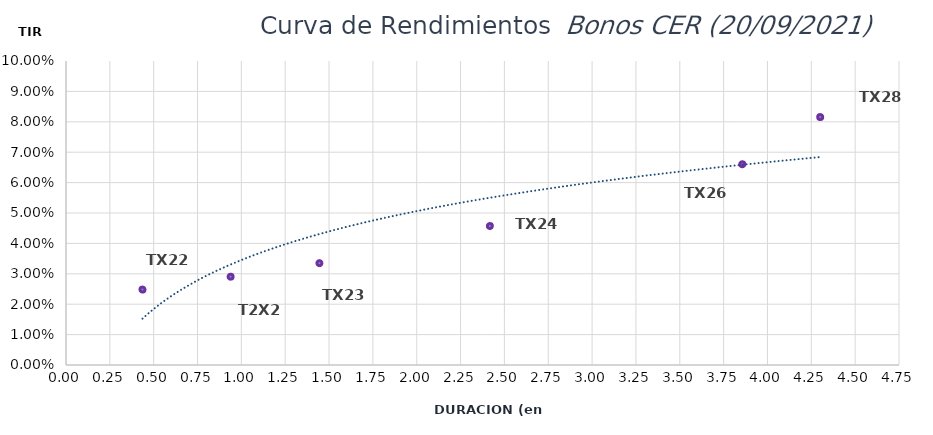
| Category | TIR N.A. |
|---|---|
| 0.4361111111111111 | 0.025 |
| 0.9384328348380259 | 0.029 |
| 1.444986178618527 | 0.033 |
| 2.416930938383553 | 0.046 |
| 3.856249162935839 | 0.066 |
| 4.300695914746465 | 0.082 |